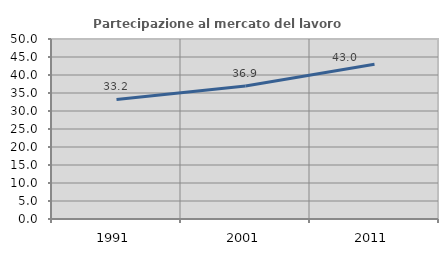
| Category | Partecipazione al mercato del lavoro  femminile |
|---|---|
| 1991.0 | 33.208 |
| 2001.0 | 36.92 |
| 2011.0 | 42.966 |